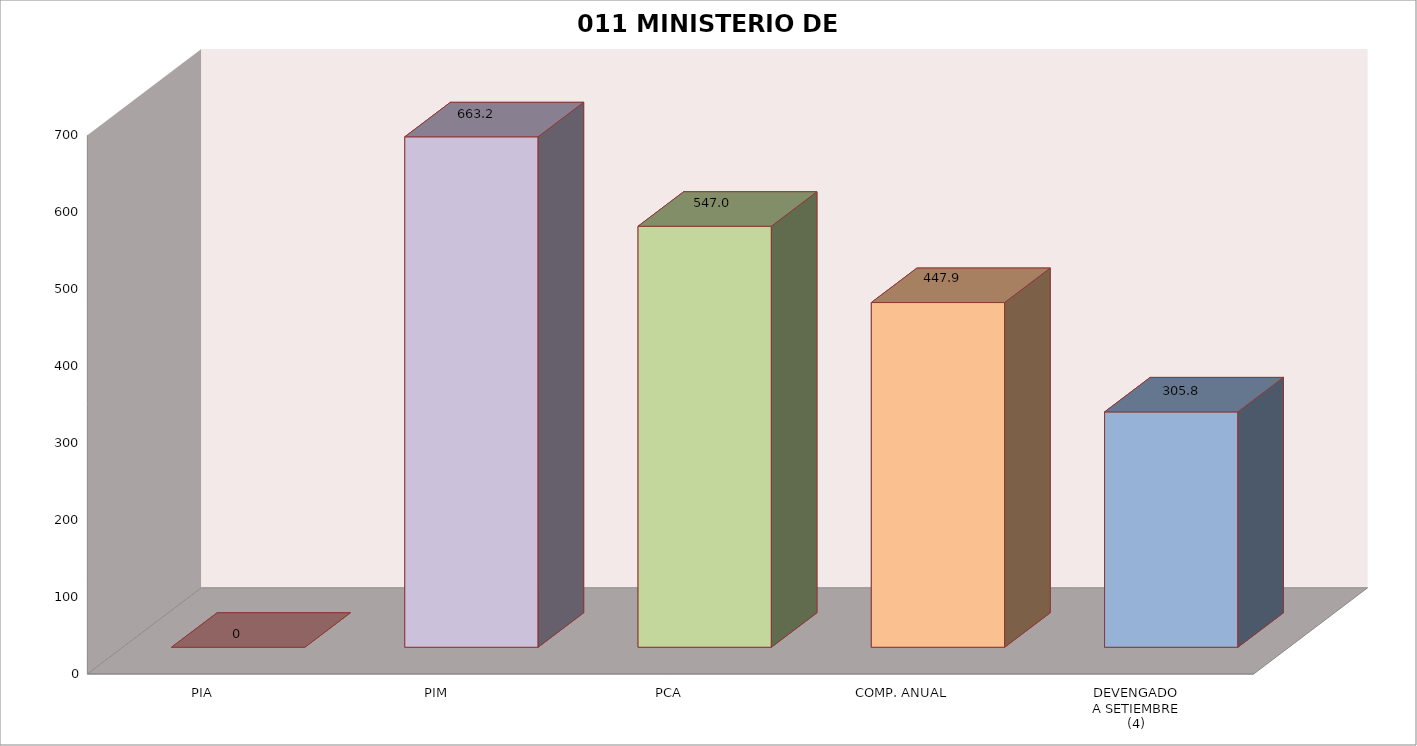
| Category | 011 MINISTERIO DE SALUD |
|---|---|
| PIA | 0 |
| PIM | 663.21 |
| PCA | 547.005 |
| COMP. ANUAL | 447.87 |
| DEVENGADO
A SETIEMBRE
(4) | 305.775 |